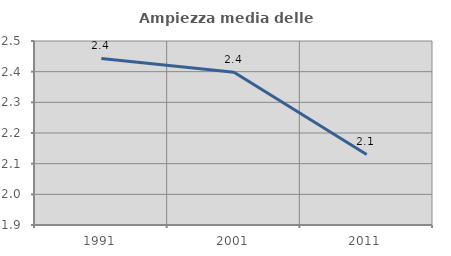
| Category | Ampiezza media delle famiglie |
|---|---|
| 1991.0 | 2.443 |
| 2001.0 | 2.398 |
| 2011.0 | 2.13 |